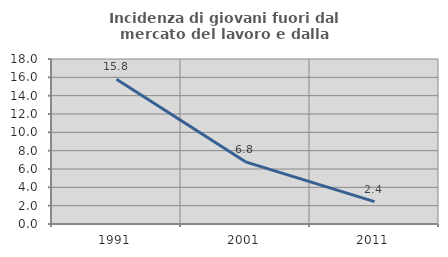
| Category | Incidenza di giovani fuori dal mercato del lavoro e dalla formazione  |
|---|---|
| 1991.0 | 15.789 |
| 2001.0 | 6.78 |
| 2011.0 | 2.439 |